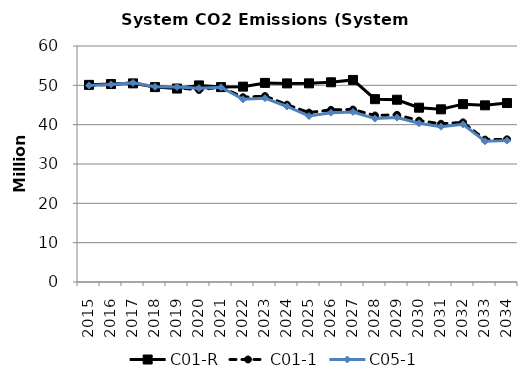
| Category | C01-R | C01-1 | C05-1 |
|---|---|---|---|
| 2015.0 | 50.118 | 49.98 | 49.98 |
| 2016.0 | 50.329 | 50.239 | 50.239 |
| 2017.0 | 50.499 | 50.623 | 50.623 |
| 2018.0 | 49.555 | 49.637 | 49.637 |
| 2019.0 | 49.181 | 49.422 | 49.593 |
| 2020.0 | 49.976 | 48.827 | 49.264 |
| 2021.0 | 49.548 | 49.578 | 49.503 |
| 2022.0 | 49.671 | 46.971 | 46.458 |
| 2023.0 | 50.618 | 47.262 | 46.735 |
| 2024.0 | 50.491 | 45.086 | 44.62 |
| 2025.0 | 50.508 | 43.063 | 42.192 |
| 2026.0 | 50.777 | 43.764 | 43.033 |
| 2027.0 | 51.38 | 43.847 | 43.224 |
| 2028.0 | 46.481 | 42.329 | 41.552 |
| 2029.0 | 46.342 | 42.511 | 41.792 |
| 2030.0 | 44.317 | 41.021 | 40.363 |
| 2031.0 | 43.901 | 40.228 | 39.493 |
| 2032.0 | 45.215 | 40.585 | 40.079 |
| 2033.0 | 44.915 | 36.207 | 35.783 |
| 2034.0 | 45.496 | 36.272 | 35.943 |